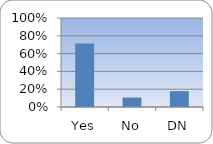
| Category | Series 0 |
|---|---|
| Yes | 0.715 |
| No | 0.107 |
| DN | 0.179 |